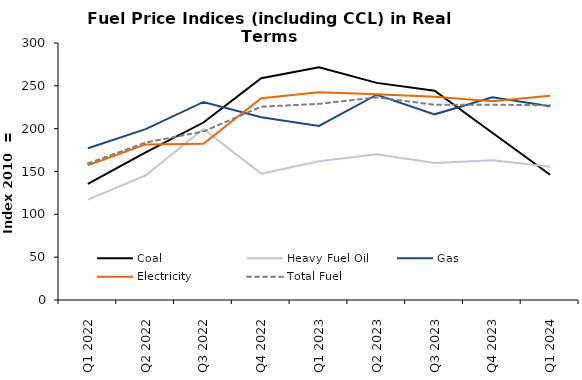
| Category | Coal | Heavy Fuel Oil | Gas | Electricity | Total Fuel |
|---|---|---|---|---|---|
| Q1 2022 | 135.415 | 117.168 | 177.142 | 157.331 | 159.367 |
| Q2 2022 | 172.345 | 145.467 | 199.403 | 181.628 | 183.823 |
| Q3 2022 | 207.176 | 199.709 | 231.173 | 182.344 | 196.734 |
| Q4 2022 | 258.813 | 147.498 | 213.272 | 235.408 | 225.651 |
| Q1 2023 | 271.715 | 161.998 | 203.172 | 242.514 | 228.97 |
| Q2 2023 | 253.451 | 170.209 | 239.604 | 240.101 | 236.539 |
| Q3 2023 | 244.215 | 159.837 | 216.731 | 237.217 | 227.881 |
| Q4 2023 | 195.176 | 163.252 | 236.673 | 231.984 | 228.004 |
| Q1 2024 | 146.138 | 155.577 | 226.258 | 238.345 | 227.275 |